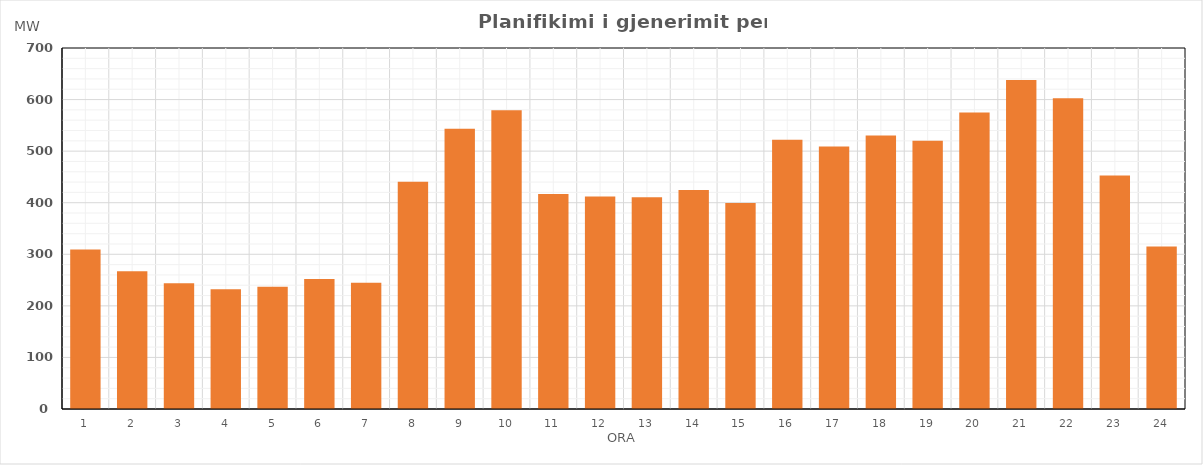
| Category | Max (MW) |
|---|---|
| 0 | 309.384 |
| 1 | 267.144 |
| 2 | 244.034 |
| 3 | 231.974 |
| 4 | 236.955 |
| 5 | 252 |
| 6 | 244.778 |
| 7 | 440.728 |
| 8 | 543.253 |
| 9 | 579.458 |
| 10 | 416.703 |
| 11 | 411.879 |
| 12 | 410.702 |
| 13 | 424.764 |
| 14 | 399.618 |
| 15 | 522.309 |
| 16 | 509.239 |
| 17 | 530.35 |
| 18 | 520.323 |
| 19 | 574.81 |
| 20 | 637.78 |
| 21 | 602.524 |
| 22 | 452.959 |
| 23 | 315.319 |